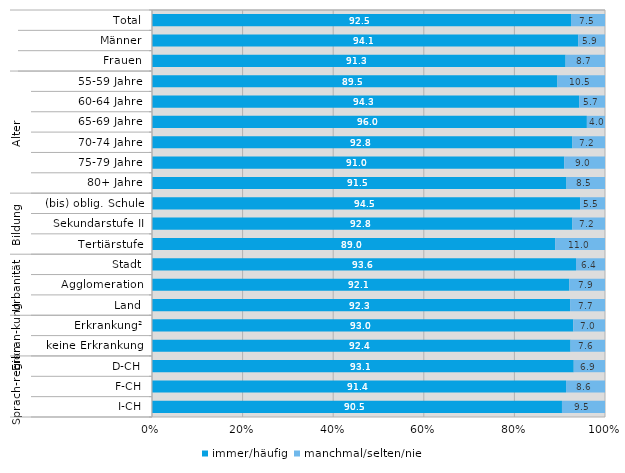
| Category | immer/häufig | manchmal/selten/nie |
|---|---|---|
| 0 | 92.5 | 7.5 |
| 1 | 94.1 | 5.9 |
| 2 | 91.3 | 8.7 |
| 3 | 89.5 | 10.5 |
| 4 | 94.3 | 5.7 |
| 5 | 96 | 4 |
| 6 | 92.8 | 7.2 |
| 7 | 91 | 9 |
| 8 | 91.5 | 8.5 |
| 9 | 94.5 | 5.5 |
| 10 | 92.8 | 7.2 |
| 11 | 89 | 11 |
| 12 | 93.6 | 6.4 |
| 13 | 92.1 | 7.9 |
| 14 | 92.3 | 7.7 |
| 15 | 93 | 7 |
| 16 | 92.4 | 7.6 |
| 17 | 93.1 | 6.9 |
| 18 | 91.4 | 8.6 |
| 19 | 90.5 | 9.5 |